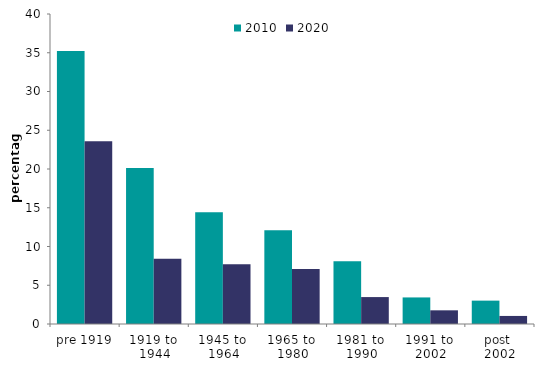
| Category | 2010 | 2020 |
|---|---|---|
| pre 1919 | 35.221 | 23.573 |
| 1919 to 
1944 | 20.131 | 8.413 |
| 1945 to 
1964 | 14.434 | 7.702 |
| 1965 to 
1980 | 12.112 | 7.092 |
| 1981 to 
1990 | 8.082 | 3.474 |
| 1991 to 
2002 | 3.428 | 1.765 |
| post 
2002 | 3.015 | 1.04 |